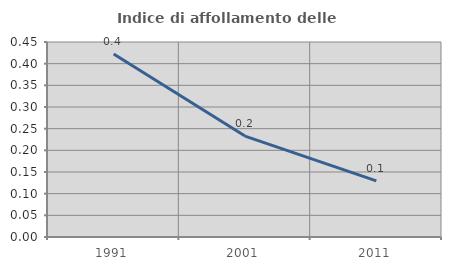
| Category | Indice di affollamento delle abitazioni  |
|---|---|
| 1991.0 | 0.422 |
| 2001.0 | 0.233 |
| 2011.0 | 0.13 |